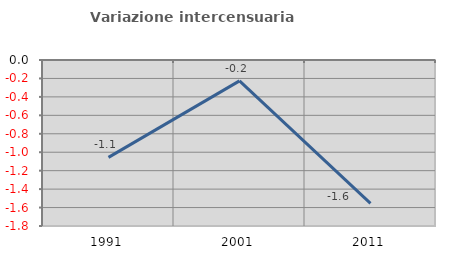
| Category | Variazione intercensuaria annua |
|---|---|
| 1991.0 | -1.055 |
| 2001.0 | -0.226 |
| 2011.0 | -1.555 |